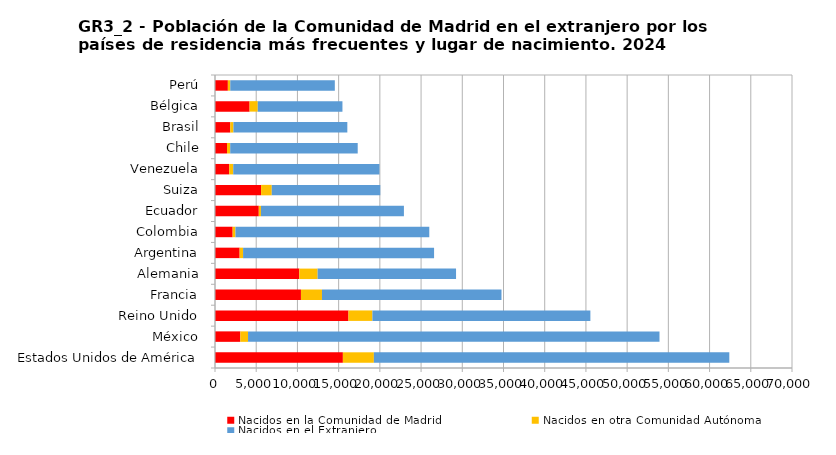
| Category | Nacidos en la Comunidad de Madrid | Nacidos en otra Comunidad Autónoma | Nacidos en el Extranjero |
|---|---|---|---|
|     Estados Unidos de América | 15514 | 3760 | 43121 |
|     México | 3073 | 935 | 49917 |
|     Reino Unido | 16193 | 2903 | 26444 |
|     Francia | 10427 | 2550 | 21779 |
|     Alemania | 10225 | 2226 | 16792 |
|     Argentina | 2989 | 418 | 23170 |
|     Colombia | 2142 | 338 | 23517 |
|     Ecuador | 5311 | 264 | 17344 |
|     Suiza | 5590 | 1296 | 13166 |
|     Venezuela | 1717 | 497 | 17738 |
|     Chile | 1453 | 394 | 15466 |
|     Brasil | 1852 | 387 | 13815 |
|     Bélgica | 4196 | 993 | 10272 |
|     Perú | 1560 | 294 | 12682 |